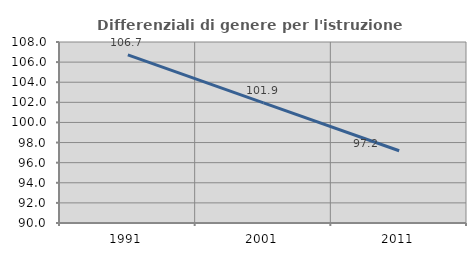
| Category | Differenziali di genere per l'istruzione superiore |
|---|---|
| 1991.0 | 106.723 |
| 2001.0 | 101.947 |
| 2011.0 | 97.182 |